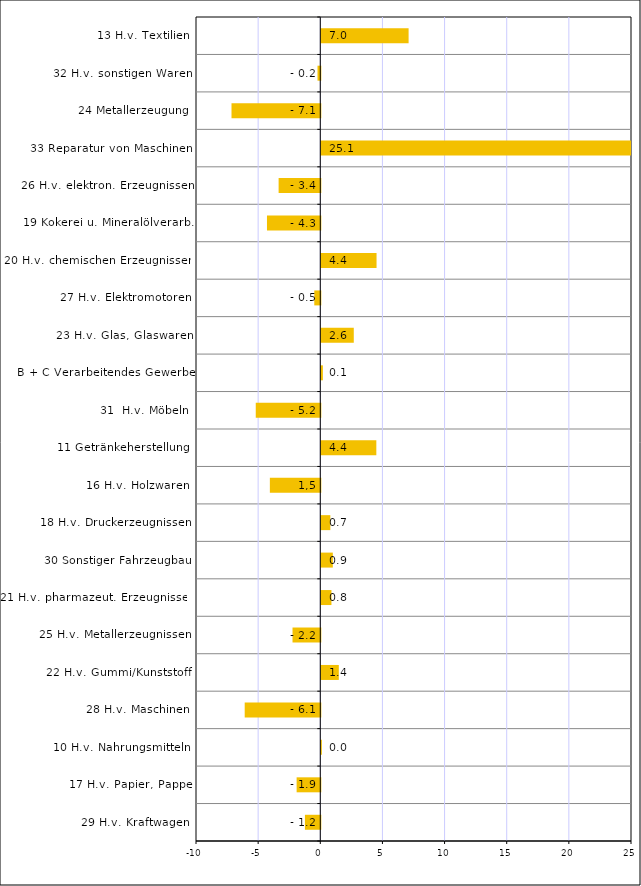
| Category | Series 0 |
|---|---|
| 29 H.v. Kraftwagen | -1.236 |
| 17 H.v. Papier, Pappe | -1.904 |
| 10 H.v. Nahrungsmitteln | 0.045 |
| 28 H.v. Maschinen | -6.082 |
| 22 H.v. Gummi/Kunststoff | 1.41 |
| 25 H.v. Metallerzeugnissen | -2.234 |
| 21 H.v. pharmazeut. Erzeugnissen | 0.817 |
| 30 Sonstiger Fahrzeugbau | 0.928 |
| 18 H.v. Druckerzeugnissen | 0.728 |
| 16 H.v. Holzwaren | -4.057 |
| 11 Getränkeherstellung | 4.429 |
| 31  H.v. Möbeln | -5.192 |
| B + C Verarbeitendes Gewerbe | 0.127 |
| 23 H.v. Glas, Glaswaren | 2.614 |
| 27 H.v. Elektromotoren | -0.483 |
| 20 H.v. chemischen Erzeugnissen | 4.446 |
| 19 Kokerei u. Mineralölverarb. | -4.289 |
| 26 H.v. elektron. Erzeugnissen | -3.353 |
| 33 Reparatur von Maschinen | 25.067 |
| 24 Metallerzeugung | -7.143 |
| 32 H.v. sonstigen Waren | -0.223 |
| 13 H.v. Textilien | 7.025 |